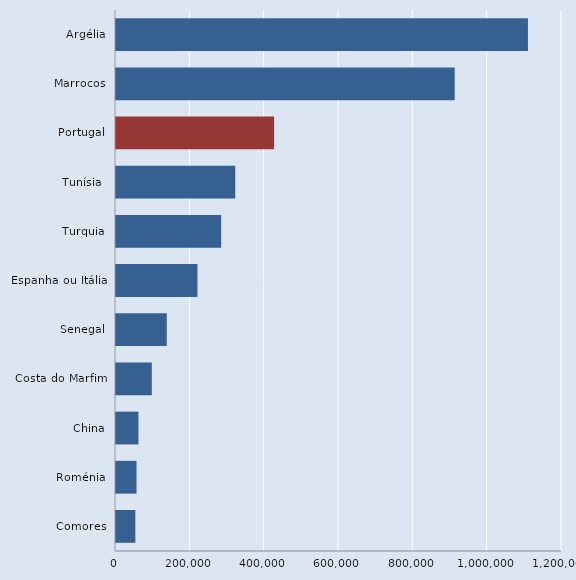
| Category | Series 0 |
|---|---|
| Argélia | 1108375 |
| Marrocos | 911360 |
| Portugal | 425412 |
| Tunísia  | 320851 |
| Turquia | 283016 |
| Espanha ou Itália | 219176 |
| Senegal | 136630 |
| Costa do Marfim | 96387 |
| China | 60450 |
| Roménia | 55246 |
| Comores | 52097 |